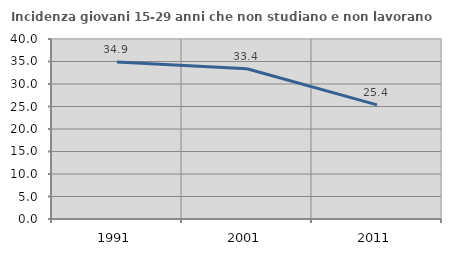
| Category | Incidenza giovani 15-29 anni che non studiano e non lavorano  |
|---|---|
| 1991.0 | 34.884 |
| 2001.0 | 33.393 |
| 2011.0 | 25.354 |